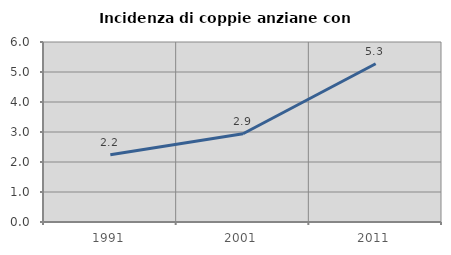
| Category | Incidenza di coppie anziane con figli |
|---|---|
| 1991.0 | 2.241 |
| 2001.0 | 2.941 |
| 2011.0 | 5.274 |